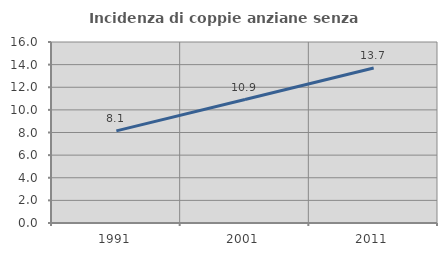
| Category | Incidenza di coppie anziane senza figli  |
|---|---|
| 1991.0 | 8.14 |
| 2001.0 | 10.913 |
| 2011.0 | 13.698 |